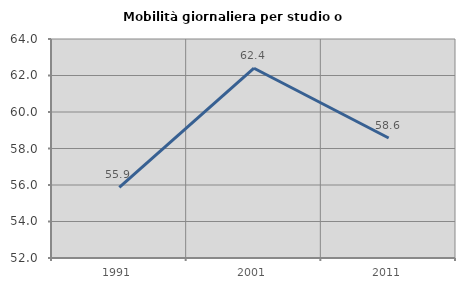
| Category | Mobilità giornaliera per studio o lavoro |
|---|---|
| 1991.0 | 55.869 |
| 2001.0 | 62.398 |
| 2011.0 | 58.577 |